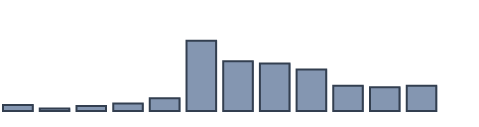
| Category | Series 0 |
|---|---|
| 0 | 1.931 |
| 1 | 0.79 |
| 2 | 1.582 |
| 3 | 2.338 |
| 4 | 4.049 |
| 5 | 22.172 |
| 6 | 15.676 |
| 7 | 14.979 |
| 8 | 13.08 |
| 9 | 7.997 |
| 10 | 7.475 |
| 11 | 7.932 |
| 12 | 0 |